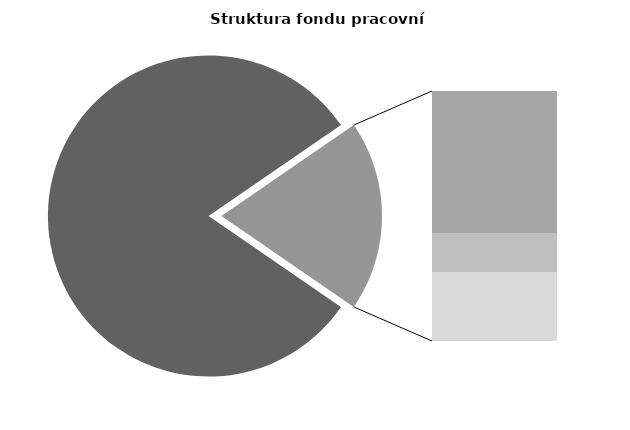
| Category | Series 0 |
|---|---|
| Průměrná měsíční odpracovaná doba bez přesčasu | 139.274 |
| Dovolená | 18.769 |
| Nemoc | 5.128 |
| Jiné | 9.123 |